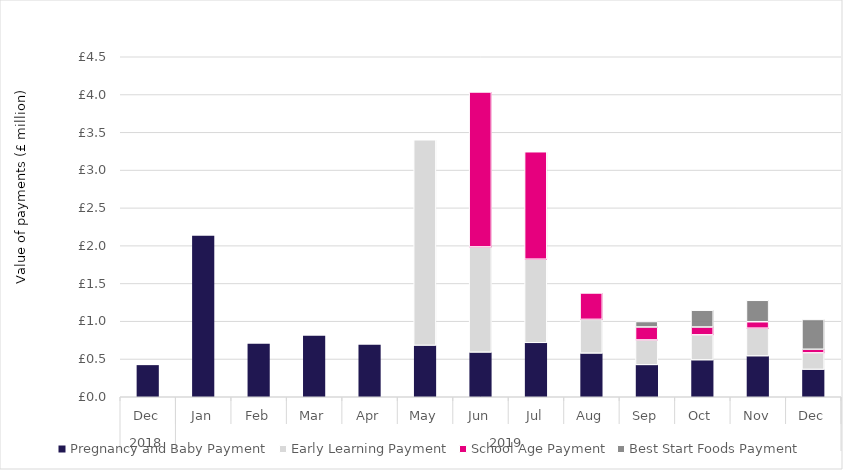
| Category | Pregnancy and Baby Payment | Early Learning Payment | School Age Payment | Best Start Foods Payment |
|---|---|---|---|---|
| 0 | 421800 | 0 | 0 | 0 |
| 1 | 2132700 | 0 | 0 | 0 |
| 2 | 705900 | 0 | 0 | 0 |
| 3 | 811800 | 0 | 0 | 0 |
| 4 | 692400 | 0 | 0 | 0 |
| 5 | 680100 | 2721250 | 0 | 0 |
| 6 | 589800 | 1393250 | 2051000 | 0 |
| 7 | 714000 | 1106500 | 1422500 | 0 |
| 8 | 576900 | 447250 | 349500 | 0 |
| 9 | 422700 | 329000 | 171750 | 72471 |
| 10 | 486900 | 332500 | 103750 | 222534.25 |
| 11 | 540000 | 367500 | 85500 | 283632.25 |
| 12 | 361800 | 219250 | 47250 | 394854.75 |